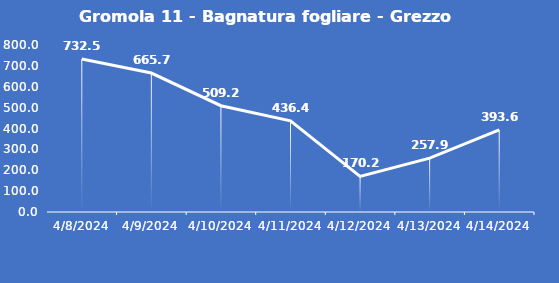
| Category | Gromola 11 - Bagnatura fogliare - Grezzo (min) |
|---|---|
| 4/8/24 | 732.5 |
| 4/9/24 | 665.7 |
| 4/10/24 | 509.2 |
| 4/11/24 | 436.4 |
| 4/12/24 | 170.2 |
| 4/13/24 | 257.9 |
| 4/14/24 | 393.6 |